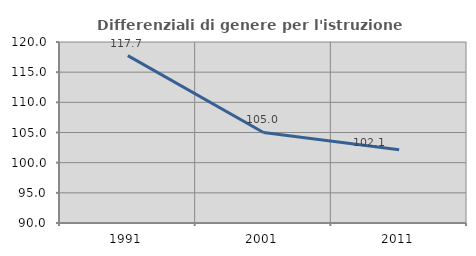
| Category | Differenziali di genere per l'istruzione superiore |
|---|---|
| 1991.0 | 117.739 |
| 2001.0 | 105.002 |
| 2011.0 | 102.132 |